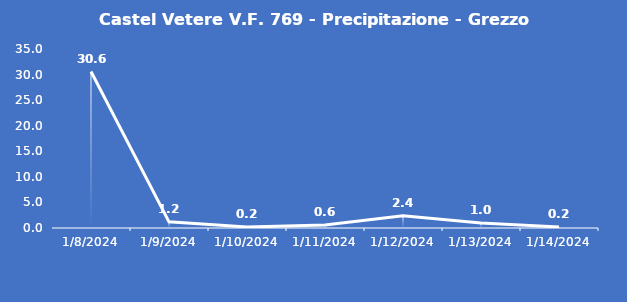
| Category | Castel Vetere V.F. 769 - Precipitazione - Grezzo (mm) |
|---|---|
| 1/8/24 | 30.6 |
| 1/9/24 | 1.2 |
| 1/10/24 | 0.2 |
| 1/11/24 | 0.6 |
| 1/12/24 | 2.4 |
| 1/13/24 | 1 |
| 1/14/24 | 0.2 |